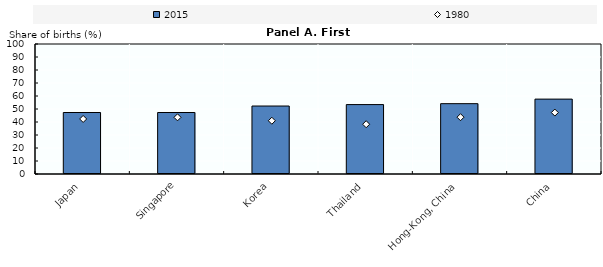
| Category | 2015 |
|---|---|
| Japan | 47.3 |
| Singapore | 47.3 |
| Korea | 52.29 |
| Thailand | 53.4 |
| Hong-Kong, China | 54.1 |
| China | 57.6 |